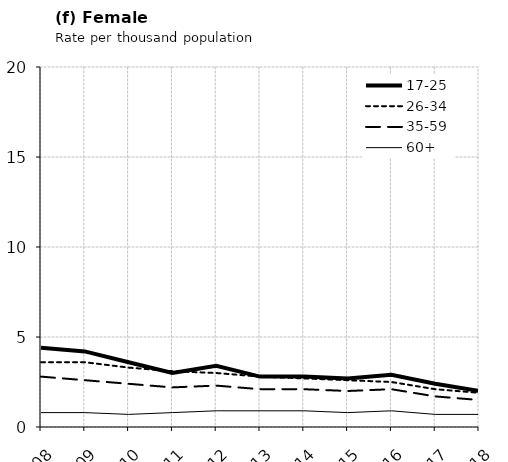
| Category | 17-25 | 26-34 | 35-59 | 60+ |
|---|---|---|---|---|
| 2008.0 | 4.4 | 3.6 | 2.8 | 0.8 |
| 2009.0 | 4.2 | 3.6 | 2.6 | 0.8 |
| 2010.0 | 3.6 | 3.3 | 2.4 | 0.7 |
| 2011.0 | 3 | 3.1 | 2.2 | 0.8 |
| 2012.0 | 3.4 | 3 | 2.3 | 0.9 |
| 2013.0 | 2.8 | 2.8 | 2.1 | 0.9 |
| 2014.0 | 2.8 | 2.7 | 2.1 | 0.9 |
| 2015.0 | 2.7 | 2.6 | 2 | 0.8 |
| 2016.0 | 2.9 | 2.5 | 2.1 | 0.9 |
| 2017.0 | 2.4 | 2.1 | 1.7 | 0.7 |
| 2018.0 | 2 | 1.9 | 1.5 | 0.7 |